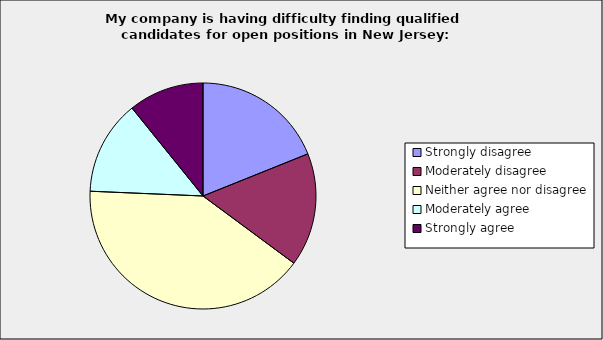
| Category | Series 0 |
|---|---|
| Strongly disagree | 0.189 |
| Moderately disagree | 0.162 |
| Neither agree nor disagree | 0.405 |
| Moderately agree | 0.135 |
| Strongly agree | 0.108 |